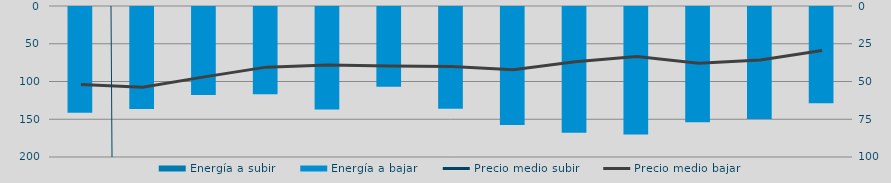
| Category | Energía a subir | Energía a bajar |
|---|---|---|
| D |  | 141.375 |
| E |  | 136.519 |
| F |  | 117.85 |
| M |  | 116.821 |
| A |  | 136.934 |
| M |  | 106.844 |
| J |  | 136.078 |
| J |  | 157.467 |
| A |  | 167.866 |
| S |  | 170.333 |
| O |  | 153.818 |
| N |  | 149.517 |
| D |  | 128.775 |